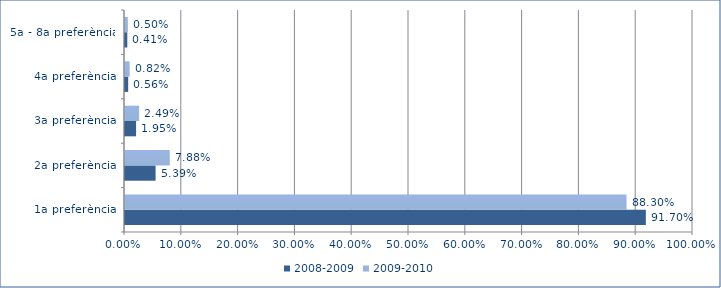
| Category | 2008-2009 | 2009-2010 |
|---|---|---|
| 1a preferència | 0.917 | 0.883 |
| 2a preferència | 0.054 | 0.079 |
| 3a preferència | 0.019 | 0.025 |
| 4a preferència | 0.006 | 0.008 |
| 5a - 8a preferència | 0.004 | 0.005 |